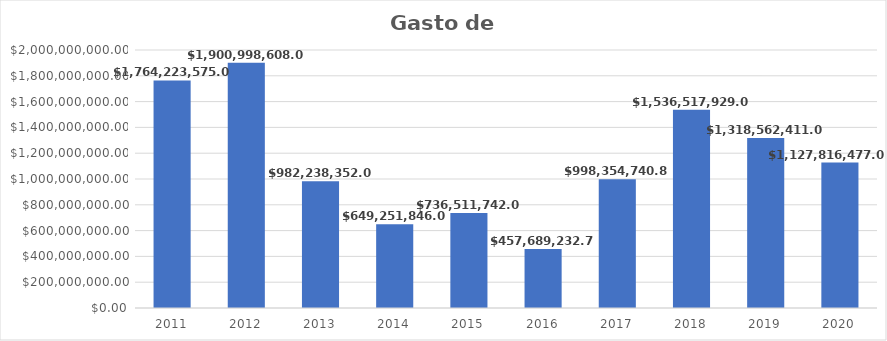
| Category | Series 1 |
|---|---|
| 2011.0 | 1764223575 |
| 2012.0 | 1900998608 |
| 2013.0 | 982238352 |
| 2014.0 | 649251846 |
| 2015.0 | 736511742 |
| 2016.0 | 457689232.77 |
| 2017.0 | 998354740.86 |
| 2018.0 | 1536517929 |
| 2019.0 | 1318562411 |
| 2020.0 | 1127816477 |